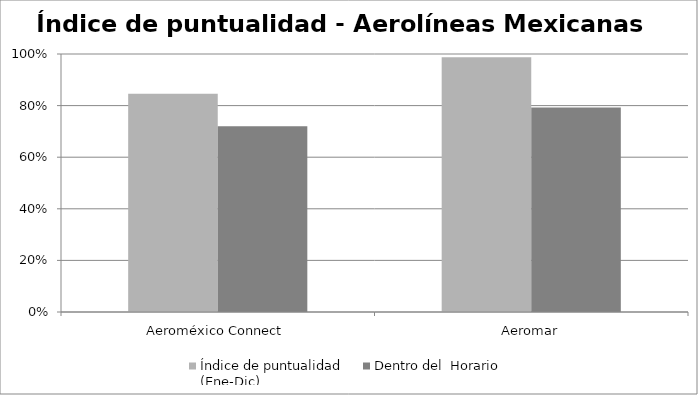
| Category | Índice de puntualidad
(Ene-Dic) | Dentro del  Horario |
|---|---|---|
| Aeroméxico Connect | 0.846 | 0.72 |
| Aeromar | 0.988 | 0.793 |